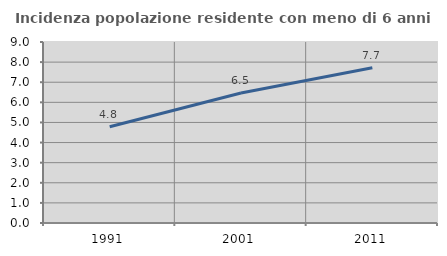
| Category | Incidenza popolazione residente con meno di 6 anni |
|---|---|
| 1991.0 | 4.784 |
| 2001.0 | 6.467 |
| 2011.0 | 7.72 |